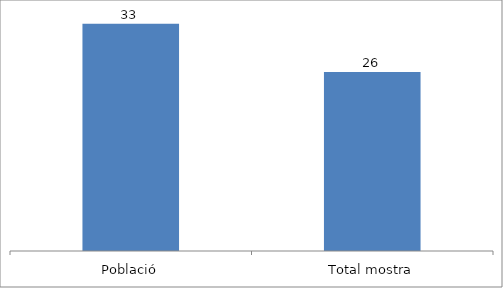
| Category | Series 0 |
|---|---|
| Població | 33 |
| Total mostra | 26 |